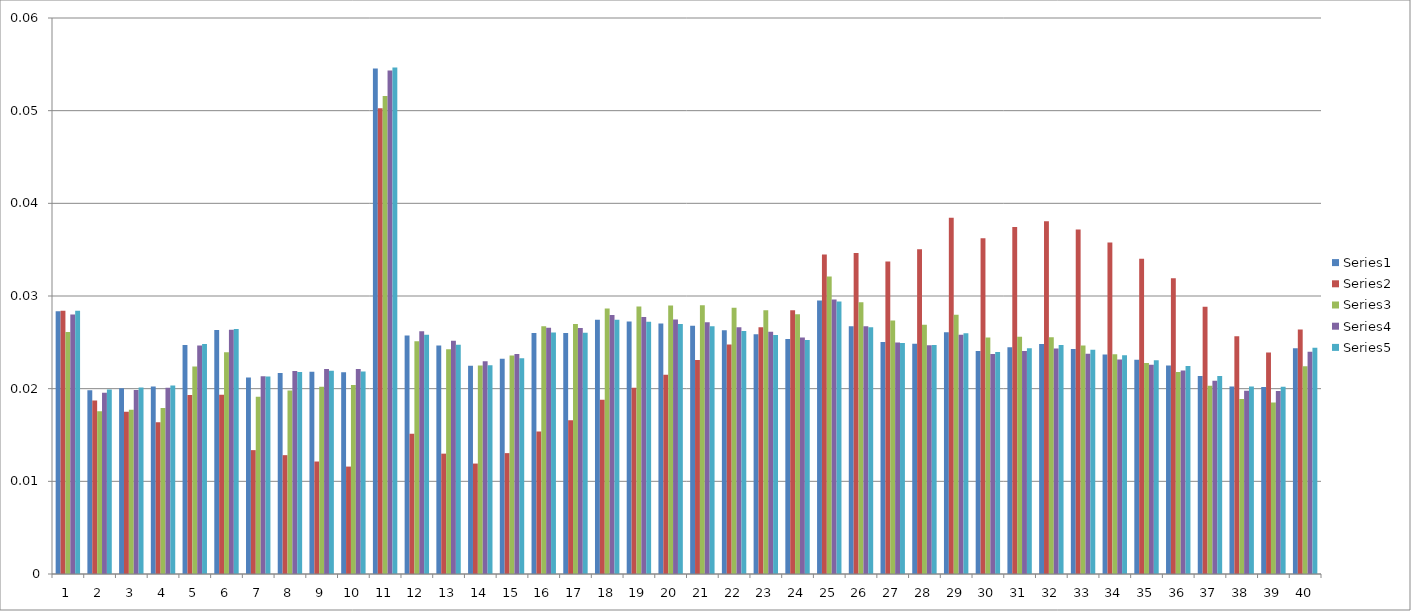
| Category | Series 0 | Series 1 | Series 2 | Series 3 | Series 4 |
|---|---|---|---|---|---|
| 0 | 0.028 | 0.028 | 0.026 | 0.028 | 0.028 |
| 1 | 0.02 | 0.019 | 0.018 | 0.02 | 0.02 |
| 2 | 0.02 | 0.018 | 0.018 | 0.02 | 0.02 |
| 3 | 0.02 | 0.016 | 0.018 | 0.02 | 0.02 |
| 4 | 0.025 | 0.019 | 0.022 | 0.025 | 0.025 |
| 5 | 0.026 | 0.019 | 0.024 | 0.026 | 0.026 |
| 6 | 0.021 | 0.013 | 0.019 | 0.021 | 0.021 |
| 7 | 0.022 | 0.013 | 0.02 | 0.022 | 0.022 |
| 8 | 0.022 | 0.012 | 0.02 | 0.022 | 0.022 |
| 9 | 0.022 | 0.012 | 0.02 | 0.022 | 0.022 |
| 10 | 0.055 | 0.05 | 0.052 | 0.054 | 0.055 |
| 11 | 0.026 | 0.015 | 0.025 | 0.026 | 0.026 |
| 12 | 0.025 | 0.013 | 0.024 | 0.025 | 0.025 |
| 13 | 0.022 | 0.012 | 0.022 | 0.023 | 0.023 |
| 14 | 0.023 | 0.013 | 0.024 | 0.024 | 0.023 |
| 15 | 0.026 | 0.015 | 0.027 | 0.027 | 0.026 |
| 16 | 0.026 | 0.017 | 0.027 | 0.027 | 0.026 |
| 17 | 0.027 | 0.019 | 0.029 | 0.028 | 0.027 |
| 18 | 0.027 | 0.02 | 0.029 | 0.028 | 0.027 |
| 19 | 0.027 | 0.021 | 0.029 | 0.027 | 0.027 |
| 20 | 0.027 | 0.023 | 0.029 | 0.027 | 0.027 |
| 21 | 0.026 | 0.025 | 0.029 | 0.027 | 0.026 |
| 22 | 0.026 | 0.027 | 0.028 | 0.026 | 0.026 |
| 23 | 0.025 | 0.028 | 0.028 | 0.026 | 0.025 |
| 24 | 0.03 | 0.034 | 0.032 | 0.03 | 0.029 |
| 25 | 0.027 | 0.035 | 0.029 | 0.027 | 0.027 |
| 26 | 0.025 | 0.034 | 0.027 | 0.025 | 0.025 |
| 27 | 0.025 | 0.035 | 0.027 | 0.025 | 0.025 |
| 28 | 0.026 | 0.038 | 0.028 | 0.026 | 0.026 |
| 29 | 0.024 | 0.036 | 0.026 | 0.024 | 0.024 |
| 30 | 0.024 | 0.037 | 0.026 | 0.024 | 0.024 |
| 31 | 0.025 | 0.038 | 0.026 | 0.024 | 0.025 |
| 32 | 0.024 | 0.037 | 0.025 | 0.024 | 0.024 |
| 33 | 0.024 | 0.036 | 0.024 | 0.023 | 0.024 |
| 34 | 0.023 | 0.034 | 0.023 | 0.023 | 0.023 |
| 35 | 0.022 | 0.032 | 0.022 | 0.022 | 0.022 |
| 36 | 0.021 | 0.029 | 0.02 | 0.021 | 0.021 |
| 37 | 0.02 | 0.026 | 0.019 | 0.02 | 0.02 |
| 38 | 0.02 | 0.024 | 0.018 | 0.02 | 0.02 |
| 39 | 0.024 | 0.026 | 0.022 | 0.024 | 0.024 |